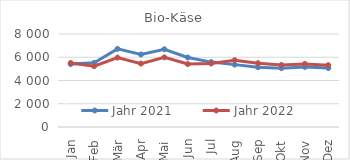
| Category | Jahr 2021 | Jahr 2022 |
|---|---|---|
| Jan | 5409.747 | 5506.883 |
| Feb | 5521.187 | 5232.714 |
| Mär | 6720.549 | 5971.301 |
| Apr | 6237.466 | 5454.565 |
| Mai | 6687.425 | 5992.187 |
| Jun | 5979.395 | 5414.064 |
| Jul | 5582.656 | 5464.028 |
| Aug | 5365.761 | 5748.173 |
| Sep | 5142.908 | 5490.28 |
| Okt | 5056.425 | 5335.636 |
| Nov | 5164.791 | 5427.973 |
| Dez | 5068.452 | 5321.062 |